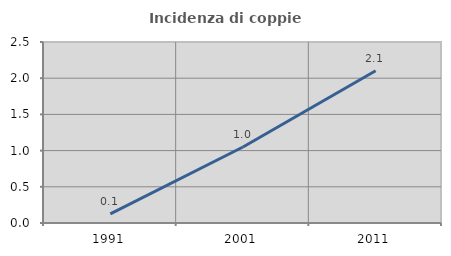
| Category | Incidenza di coppie miste |
|---|---|
| 1991.0 | 0.125 |
| 2001.0 | 1.05 |
| 2011.0 | 2.103 |